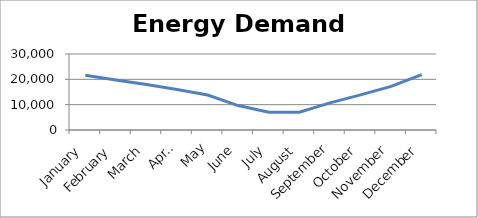
| Category | Energy Demand |
|---|---|
| January | 21601.736 |
| February | 19758.737 |
| March | 17996.962 |
| April | 15971.15 |
| May | 13788.016 |
| June | 9640.479 |
| July | 6988.8 |
| August | 6988.8 |
| September | 10728.372 |
| October | 13884.226 |
| November | 17213.55 |
| December | 21841.734 |